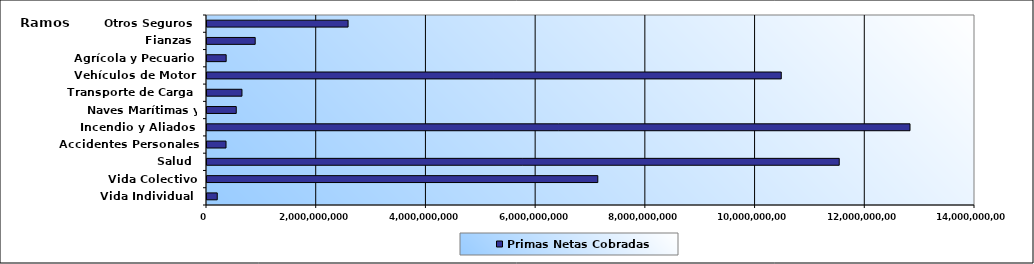
| Category | Primas Netas Cobradas |
|---|---|
| Vida Individual  | 186924386.97 |
| Vida Colectivo | 7123989067.43 |
| Salud  | 11525126647.08 |
| Accidentes Personales | 346701668.73 |
| Incendio y Aliados  | 12815111330.78 |
| Naves Marítimas y Aéreas  | 533379842.78 |
| Transporte de Carga  | 637352053.24 |
| Vehículos de Motor  | 10468638004.85 |
| Agrícola y Pecuario  | 349443965.52 |
| Fianzas  | 878574871.61 |
| Otros Seguros  | 2571786735.16 |